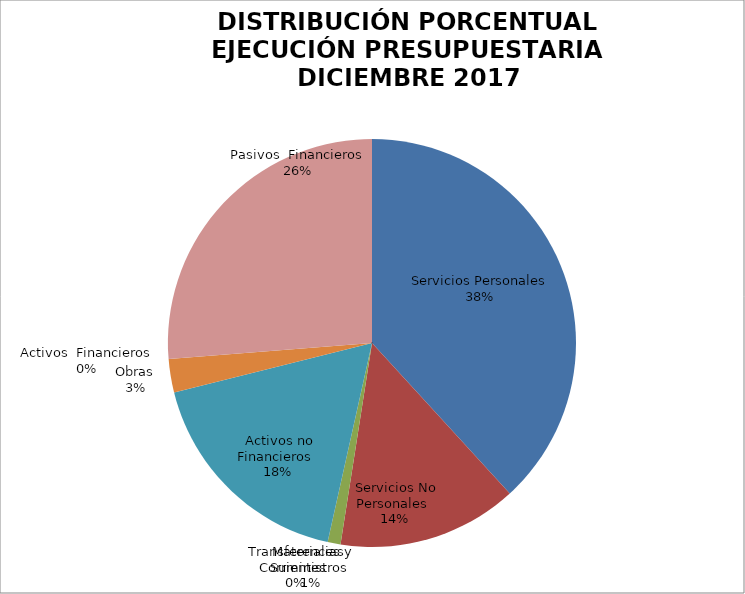
| Category | Series 0 | Series 1 |
|---|---|---|
| Servicios Personales | 20001307.79 | 0.382 |
| Servicios No Personales | 7472279.24 | 0.143 |
| Materiales y Suministros | 535200.88 | 0.01 |
| Transferencias Corrientes | 0 | 0 |
| Activos no Financieros | 9220778.66 | 0.176 |
| Obras | 1386836.52 | 0.153 |
| Activos  Financieros | 0 | 0 |
| Pasivos  Financieros | 13744530.14 | 0.262 |